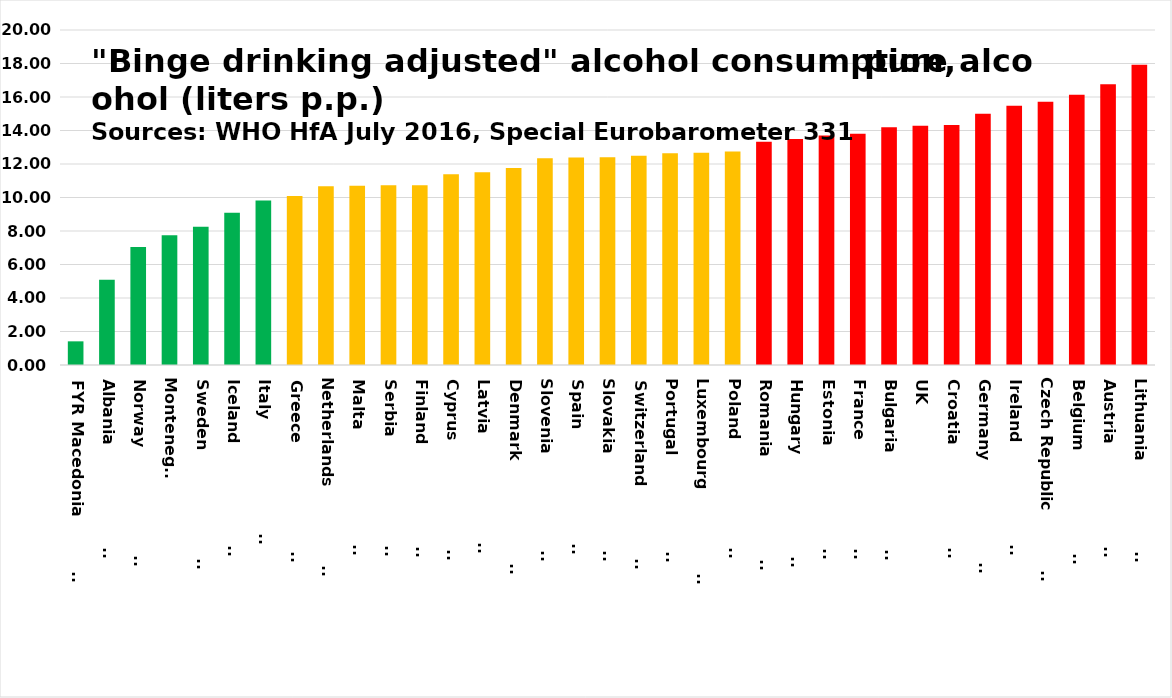
| Category | Series 0 |
|---|---|
| FYR Macedonia                | 1.412 |
| Albania                       | 5.096 |
| Norway                        | 7.045 |
| Montenegro | 7.741 |
| Sweden                        | 8.249 |
| Iceland                       | 9.089 |
| Italy                         | 9.828 |
| Greece                        | 10.09 |
| Netherlands                   | 10.676 |
| Malta                         | 10.697 |
| Serbia                        | 10.726 |
| Finland                       | 10.736 |
| Cyprus                        | 11.39 |
| Latvia                        | 11.511 |
| Denmark                       | 11.761 |
| Slovenia                      | 12.343 |
| Spain                         | 12.395 |
| Slovakia                      | 12.402 |
| Switzerland                   | 12.493 |
| Portugal                      | 12.646 |
| Luxembourg                    | 12.677 |
| Poland                        | 12.745 |
| Romania                       | 13.33 |
| Hungary                       | 13.491 |
| Estonia                       | 13.7 |
| France                        | 13.8 |
| Bulgaria                      | 14.195 |
| UK | 14.284 |
| Croatia                       | 14.325 |
| Germany                       | 15.001 |
| Ireland                       | 15.48 |
| Czech Republic                | 15.723 |
| Belgium                       | 16.128 |
| Austria                       | 16.755 |
| Lithuania                     | 17.924 |